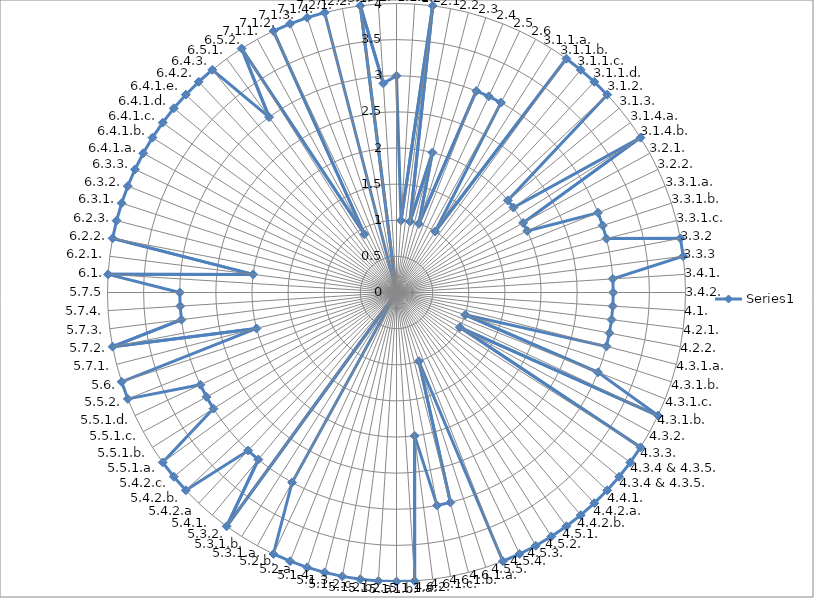
| Category | Series 0 |
|---|---|
| 1.1.1 | 3 |
| 1.1.2 | 1 |
| 1.2 | 4 |
| 2.1 | 1 |
| 2.2 | 2 |
| 2.3 | 1 |
| 2.4 | 3 |
| 2.5 | 3 |
| 2.6 | 3 |
| 3.1.1.a. | 1 |
| 3.1.1.b. | 4 |
| 3.1.1.c. | 4 |
| 3.1.1.d. | 4 |
| 3.1.2. | 4 |
| 3.1.3. | 2 |
| 3.1.4.a. | 2 |
| 3.1.4.b. | 4 |
| 3.2.1. | 2 |
| 3.2.2. | 2 |
| 3.3.1.a. | 3 |
| 3.3.1.b. | 3 |
| 3.3.1.c. | 3 |
| 3.3.2 | 4 |
| 3.3.3 | 4 |
| 3.4.1. | 3 |
| 3.4.2. | 3 |
| 4.1. | 3 |
| 4.2.1. | 3 |
| 4.2.2. | 3 |
| 4.3.1.a. | 3 |
| 4.3.1.b. | 1 |
| 4.3.1.c. | 3 |
| 4.3.1.b. | 4 |
| 4.3.2. | 1 |
| 4.3.3. | 4 |
| 4.3.4 & 4.3.5. | 4 |
| 4.3.4 & 4.3.5. | 4 |
| 4.4.1. | 4 |
| 4.4.2.a. | 4 |
| 4.4.2.b. | 4 |
| 4.5.1. | 4 |
| 4.5.2. | 4 |
| 4.5.3. | 4 |
| 4.5.4. | 4 |
| 4.5.5. | 4 |
| 4.6.1.a. | 1 |
| 4.6.1.b. | 3 |
| 4.6.1.c. | 3 |
| 4.6.2. | 2 |
| 5.1.1.a. | 4 |
| 5.1.1.b. | 4 |
| 5.1.2.a. | 4 |
| 5.1.2.b. | 4 |
| 5.1.2.c. | 4 |
| 5.1.3. | 4 |
| 5.1.4. | 4 |
| 5.2.a. | 4 |
| 5.2.b. | 4 |
| 5.3.1.a. | 3 |
| 5.3.1.b. | 0 |
| 5.3.2. | 4 |
| 5.4.1. | 3 |
| 5.4.2.a | 3 |
| 5.4.2.b. | 4 |
| 5.4.2.c. | 4 |
| 5.5.1.a. | 4 |
| 5.5.1.b. | 3 |
| 5.5.1.c. | 3 |
| 5.5.1.d. | 3 |
| 5.5.2. | 4 |
| 5.6. | 4 |
| 5.7.1. | 2 |
| 5.7.2. | 4 |
| 5.7.3. | 3 |
| 5.7.4. | 3 |
| 5.7.5 | 3 |
| 6.1. | 4 |
| 6.2.1. | 2 |
| 6.2.2. | 4 |
| 6.2.3. | 4 |
| 6.3.1. | 4 |
| 6.3.2. | 4 |
| 6.3.3. | 4 |
| 6.4.1.a. | 4 |
| 6.4.1.b. | 4 |
| 6.4.1.c. | 4 |
| 6.4.1.d. | 4 |
| 6.4.1.e. | 4 |
| 6.4.2. | 4 |
| 6.4.3. | 4 |
| 6.5.1. | 3 |
| 6.5.2. | 4 |
| 7.1.1. | 0.92 |
| 7.1.2. | 4 |
| 7.1.3. | 4 |
| 7.1.4. | 4 |
| 7.2.1. | 4 |
| 7.2.2. | 0 |
| 7.3.1. | 4 |
| 7.3.2. | 2.9 |